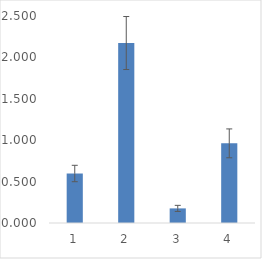
| Category | Series 0 |
|---|---|
| 0 | 0.598 |
| 1 | 2.174 |
| 2 | 0.176 |
| 3 | 0.962 |